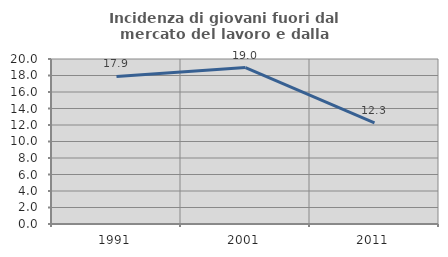
| Category | Incidenza di giovani fuori dal mercato del lavoro e dalla formazione  |
|---|---|
| 1991.0 | 17.885 |
| 2001.0 | 18.957 |
| 2011.0 | 12.254 |